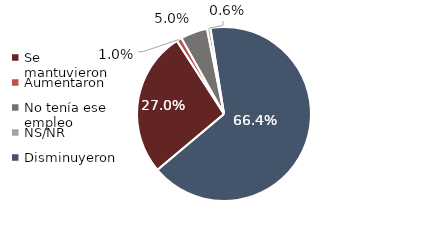
| Category | Series 0 |
|---|---|
| Se mantuvieron | 40953.266 |
| Aumentaron | 1472.644 |
| No tenía ese empleo | 7590.437 |
| NS/NR | 955.198 |
| Disminuyeron | 100706.38 |